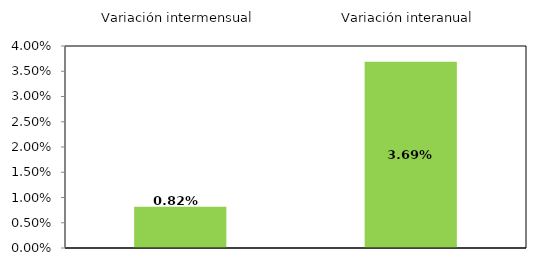
| Category | Series 0 |
|---|---|
| 0 | 0.817 |
| 1 | 3.687 |